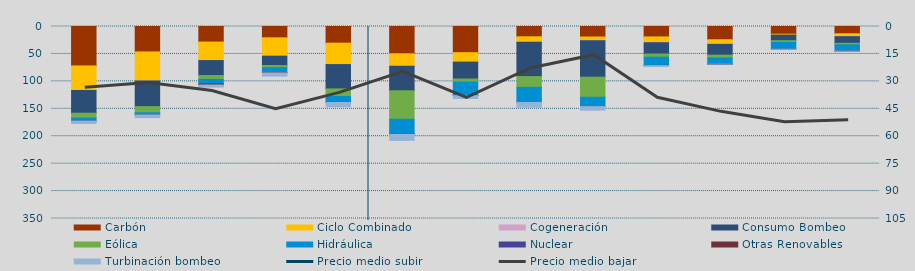
| Category | Carbón | Ciclo Combinado | Cogeneración | Consumo Bombeo | Eólica | Hidráulica | Nuclear | Otras Renovables | Turbinación bombeo |
|---|---|---|---|---|---|---|---|---|---|
| A | 71875.8 | 44407.8 | 356.8 | 41443.4 | 8916.4 | 5181.1 | 179.2 | 0 | 4517 |
| S | 46377.5 | 52485.1 | 420.2 | 46799.1 | 11262.5 | 3698.4 | 178.3 | 0 | 4969.7 |
| O | 28352.7 | 33701.8 | 72.5 | 27285.6 | 6968.9 | 8057.2 | 1524.1 | 736.2 | 3817.1 |
| N | 20637.7 | 33409.3 | 40.8 | 17072.8 | 3847.5 | 8820.4 | 0 | 757.7 | 5932.4 |
| D | 30371.3 | 38818.7 | 239.5 | 44331.3 | 13873.3 | 10280.7 | 108.3 | 133.8 | 8046.3 |
| E | 49749 | 21689 | 1091.7 | 44705.2 | 51833.3 | 26560.6 | 159.6 | 521.7 | 11348.4 |
| F | 47780.9 | 17066.1 | 83.8 | 30784 | 5603.4 | 24359.1 | 40 | 286.6 | 5220.7 |
| M | 18764.1 | 9673.8 | 444.5 | 62414.7 | 19679.2 | 27422.5 | 0 | 20.9 | 8766.8 |
| A | 19179.5 | 6106.3 | 488.3 | 66560.4 | 36687.3 | 16841.6 | 0 | 122 | 6609.5 |
| M | 18994.1 | 10277 | 353.4 | 20633.9 | 5611.8 | 15058.8 | 96.2 | 322.7 | 1709.2 |
| J | 24116.3 | 8196.7 | 265.7 | 19665.3 | 5033.9 | 11035.4 | 68.9 | 6.7 | 99.1 |
| J | 14004.7 | 1618.9 | 0 | 10261.3 | 3196.4 | 12305.1 | 26 | 0 | 119 |
| A | 13306.6 | 5191.1 | 57.6 | 12019.4 | 2979.3 | 11389.1 | 0 | 6.3 | 169.4 |